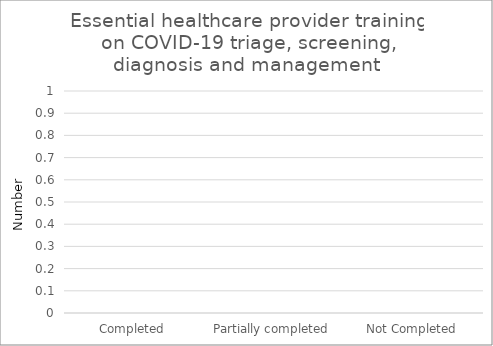
| Category | Essential healthcare provider training on COVID-19 triage, screening, diagnosis and management  |
|---|---|
| Completed | 0 |
| Partially completed | 0 |
| Not Completed | 0 |